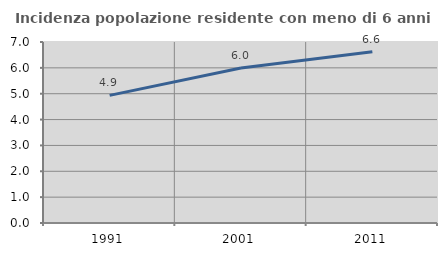
| Category | Incidenza popolazione residente con meno di 6 anni |
|---|---|
| 1991.0 | 4.937 |
| 2001.0 | 5.998 |
| 2011.0 | 6.623 |